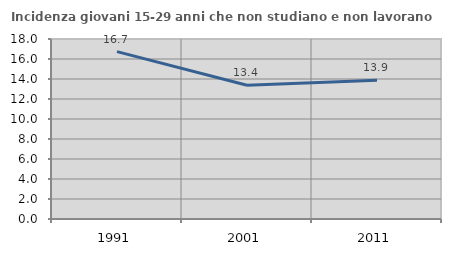
| Category | Incidenza giovani 15-29 anni che non studiano e non lavorano  |
|---|---|
| 1991.0 | 16.735 |
| 2001.0 | 13.374 |
| 2011.0 | 13.872 |